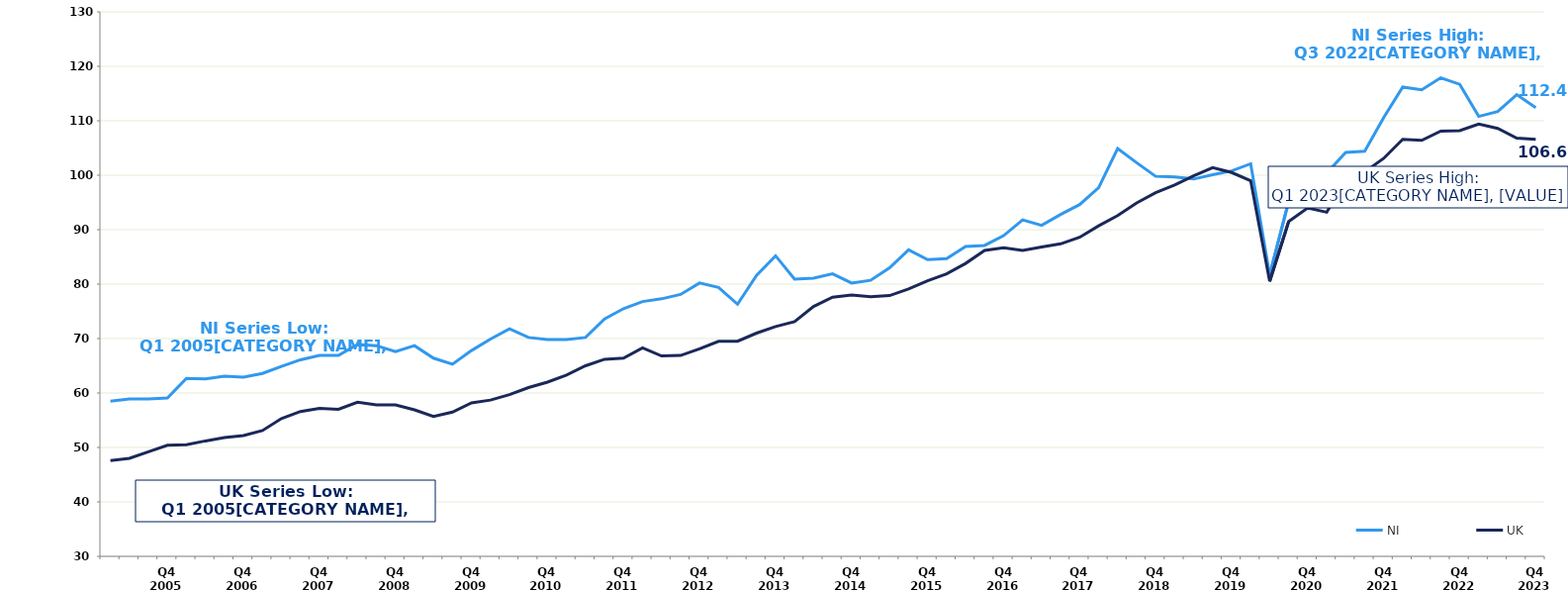
| Category | NI | UK |
|---|---|---|
|  | 58.5 | 47.6 |
|  | 58.9 | 48 |
|  | 58.9 | 49.2 |
| Q4 2005 | 59.1 | 50.4 |
|  | 62.7 | 50.5 |
|  | 62.6 | 51.2 |
|  | 63.1 | 51.8 |
| Q4 2006 | 62.9 | 52.2 |
|  | 63.6 | 53.1 |
|  | 64.9 | 55.3 |
|  | 66.1 | 56.6 |
| Q4 2007 | 66.9 | 57.2 |
|  | 66.9 | 57 |
|  | 68.9 | 58.3 |
|  | 68.7 | 57.8 |
| Q4 2008 | 67.6 | 57.8 |
|  | 68.7 | 56.9 |
|  | 66.4 | 55.7 |
|  | 65.3 | 56.5 |
| Q4 2009 | 67.8 | 58.2 |
|  | 69.9 | 58.7 |
|  | 71.8 | 59.7 |
|  | 70.2 | 61 |
| Q4 2010 | 69.8 | 62 |
|  | 69.8 | 63.3 |
|  | 70.2 | 65 |
|  | 73.6 | 66.2 |
| Q4 2011 | 75.5 | 66.4 |
|  | 76.8 | 68.3 |
|  | 77.3 | 66.8 |
|  | 78.1 | 66.9 |
| Q4 2012 | 80.2 | 68.1 |
|  | 79.4 | 69.5 |
|  | 76.3 | 69.5 |
|  | 81.6 | 71 |
| Q4 2013 | 85.2 | 72.2 |
|  | 80.9 | 73.1 |
|  | 81.1 | 75.9 |
|  | 81.9 | 77.6 |
| Q4 2014 | 80.2 | 78 |
|  | 80.7 | 77.7 |
|  | 83 | 77.9 |
|  | 86.3 | 79.1 |
| Q4 2015 | 84.5 | 80.6 |
|  | 84.7 | 81.9 |
|  | 86.9 | 83.8 |
|  | 87.1 | 86.2 |
| Q4 2016 | 88.9 | 86.7 |
|  | 91.8 | 86.2 |
|  | 90.8 | 86.8 |
|  | 92.8 | 87.4 |
| Q4 2017 | 94.6 | 88.6 |
|  | 97.7 | 90.7 |
|  | 104.9 | 92.6 |
|  | 102.3 | 94.9 |
| Q4 2018 | 99.8 | 96.8 |
|  | 99.7 | 98.2 |
|  | 99.3 | 99.9 |
|  | 100.1 | 101.4 |
| Q4 2019 | 100.8 | 100.5 |
|  | 102.1 | 99 |
|  | 81.7 | 80.5 |
|  | 95.2 | 91.5 |
| Q4 2020 | 99.9 | 94 |
|  | 100.4 | 93.2 |
|  | 104.2 | 98.8 |
|  | 104.4 | 100.6 |
| Q4 2021 | 110.6 | 103.1 |
|  | 116.2 | 106.6 |
|  | 115.7 | 106.4 |
|  | 117.9 | 108.1 |
| Q4 2022 | 116.7 | 108.2 |
|  | 110.8 | 109.4 |
|  | 111.7 | 108.6 |
|  | 114.8 | 106.8 |
| Q4 2023 | 112.4 | 106.6 |